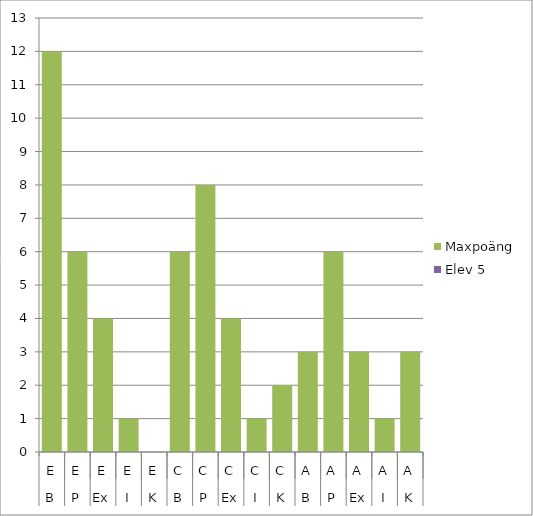
| Category | Maxpoäng | Elev 5 |
|---|---|---|
| 0 | 12 | 0 |
| 1 | 6 | 0 |
| 2 | 4 | 0 |
| 3 | 1 | 0 |
| 4 | 0 | 0 |
| 5 | 6 | 0 |
| 6 | 8 | 0 |
| 7 | 4 | 0 |
| 8 | 1 | 0 |
| 9 | 2 | 0 |
| 10 | 3 | 0 |
| 11 | 6 | 0 |
| 12 | 3 | 0 |
| 13 | 1 | 0 |
| 14 | 3 | 0 |